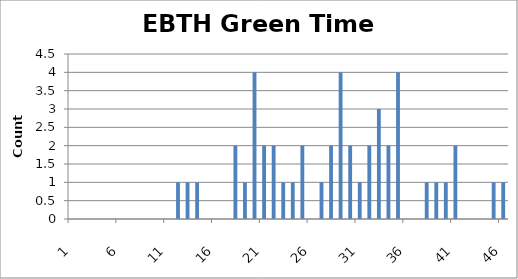
| Category | Series 0 |
|---|---|
| 0 | 0 |
| 1 | 0 |
| 2 | 0 |
| 3 | 0 |
| 4 | 0 |
| 5 | 0 |
| 6 | 0 |
| 7 | 0 |
| 8 | 0 |
| 9 | 0 |
| 10 | 0 |
| 11 | 1 |
| 12 | 1 |
| 13 | 1 |
| 14 | 0 |
| 15 | 0 |
| 16 | 0 |
| 17 | 2 |
| 18 | 1 |
| 19 | 4 |
| 20 | 2 |
| 21 | 2 |
| 22 | 1 |
| 23 | 1 |
| 24 | 2 |
| 25 | 0 |
| 26 | 1 |
| 27 | 2 |
| 28 | 4 |
| 29 | 2 |
| 30 | 1 |
| 31 | 2 |
| 32 | 3 |
| 33 | 2 |
| 34 | 4 |
| 35 | 0 |
| 36 | 0 |
| 37 | 1 |
| 38 | 1 |
| 39 | 1 |
| 40 | 2 |
| 41 | 0 |
| 42 | 0 |
| 43 | 0 |
| 44 | 1 |
| 45 | 1 |